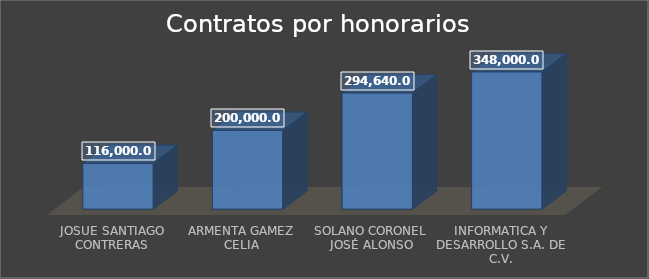
| Category | Total  |
|---|---|
| JOSUE SANTIAGO CONTRERAS | 116000 |
| ARMENTA GAMEZ CELIA | 200000 |
| SOLANO CORONEL JOSÉ ALONSO | 294640 |
| INFORMATICA Y DESARROLLO S.A. DE C.V. | 348000 |